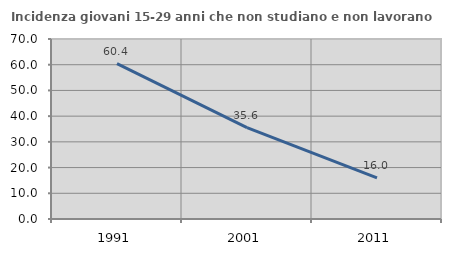
| Category | Incidenza giovani 15-29 anni che non studiano e non lavorano  |
|---|---|
| 1991.0 | 60.424 |
| 2001.0 | 35.57 |
| 2011.0 | 15.957 |